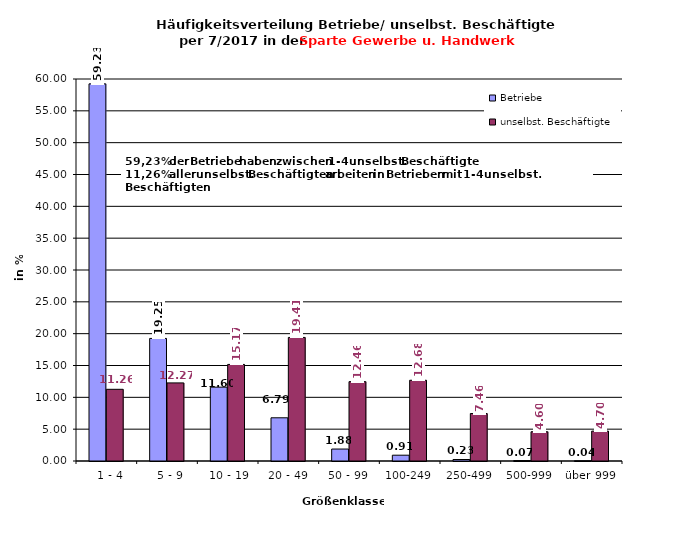
| Category | Betriebe | unselbst. Beschäftigte |
|---|---|---|
|   1 - 4 | 59.234 | 11.262 |
|   5 - 9 | 19.252 | 12.268 |
|  10 - 19 | 11.596 | 15.167 |
| 20 - 49 | 6.787 | 19.408 |
| 50 - 99 | 1.878 | 12.463 |
| 100-249 | 0.911 | 12.682 |
| 250-499 | 0.235 | 7.457 |
| 500-999 | 0.071 | 4.596 |
| über 999 | 0.036 | 4.697 |